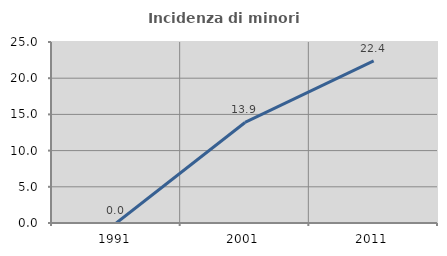
| Category | Incidenza di minori stranieri |
|---|---|
| 1991.0 | 0 |
| 2001.0 | 13.889 |
| 2011.0 | 22.388 |